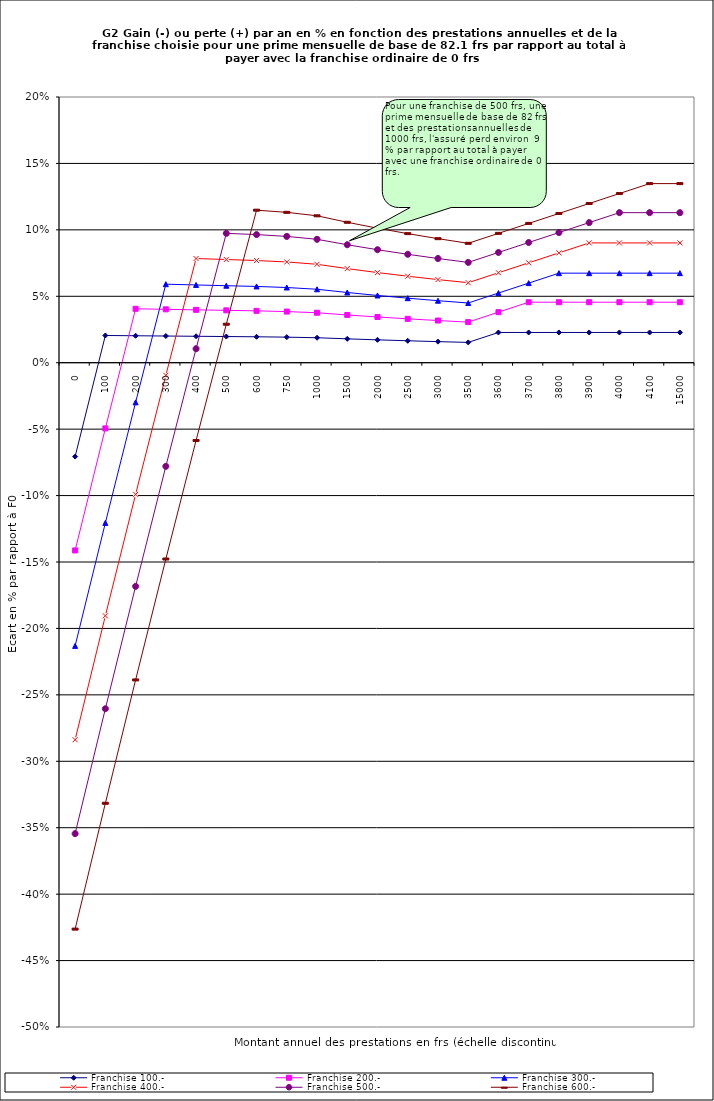
| Category | Franchise 100.- | Franchise 200.- | Franchise 300.- | Franchise 400.- | Franchise 500.- | Franchise 600.- |
|---|---|---|---|---|---|---|
| 0.0 | -0.071 | -0.141 | -0.213 | -0.284 | -0.354 | -0.426 |
| 100.0 | 0.02 | -0.049 | -0.121 | -0.191 | -0.26 | -0.332 |
| 200.0 | 0.02 | 0.041 | -0.03 | -0.099 | -0.168 | -0.239 |
| 300.0 | 0.02 | 0.04 | 0.059 | -0.009 | -0.078 | -0.148 |
| 400.0 | 0.02 | 0.04 | 0.059 | 0.078 | 0.011 | -0.059 |
| 500.0 | 0.02 | 0.039 | 0.058 | 0.078 | 0.097 | 0.029 |
| 600.0 | 0.02 | 0.039 | 0.057 | 0.077 | 0.096 | 0.115 |
| 750.0 | 0.019 | 0.038 | 0.057 | 0.076 | 0.095 | 0.113 |
| 1000.0 | 0.019 | 0.038 | 0.055 | 0.074 | 0.093 | 0.111 |
| 1500.0 | 0.018 | 0.036 | 0.053 | 0.071 | 0.089 | 0.106 |
| 2000.0 | 0.017 | 0.034 | 0.051 | 0.068 | 0.085 | 0.101 |
| 2500.0 | 0.017 | 0.033 | 0.049 | 0.065 | 0.082 | 0.097 |
| 3000.0 | 0.016 | 0.032 | 0.047 | 0.063 | 0.078 | 0.093 |
| 3500.0 | 0.015 | 0.031 | 0.045 | 0.06 | 0.075 | 0.09 |
| 3600.0 | 0.023 | 0.038 | 0.052 | 0.068 | 0.083 | 0.097 |
| 3700.0 | 0.023 | 0.046 | 0.06 | 0.075 | 0.09 | 0.105 |
| 3800.0 | 0.023 | 0.046 | 0.067 | 0.083 | 0.098 | 0.112 |
| 3900.0 | 0.023 | 0.046 | 0.067 | 0.09 | 0.105 | 0.12 |
| 4000.0 | 0.023 | 0.046 | 0.067 | 0.09 | 0.113 | 0.127 |
| 4100.0 | 0.023 | 0.046 | 0.067 | 0.09 | 0.113 | 0.135 |
| 15000.0 | 0.023 | 0.046 | 0.067 | 0.09 | 0.113 | 0.135 |